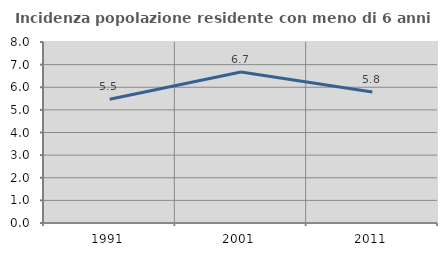
| Category | Incidenza popolazione residente con meno di 6 anni |
|---|---|
| 1991.0 | 5.47 |
| 2001.0 | 6.674 |
| 2011.0 | 5.79 |